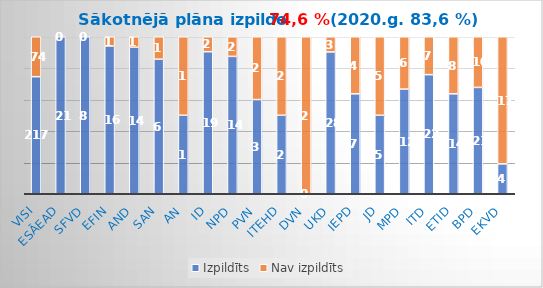
| Category | Izpildīts | Nav izpildīts |
|---|---|---|
| Visi | 217 | 74 |
| ESĀEAD | 21 | 0 |
| SFVD | 8 | 0 |
| EFIN | 16 | 1 |
| AND | 14 | 1 |
| SAN | 6 | 1 |
| AN | 1 | 1 |
| ID | 19 | 2 |
| NPD | 14 | 2 |
| PVN | 3 | 2 |
| ITEHD | 2 | 2 |
| DVN | 0 | 2 |
| UKD | 28 | 3 |
| IEPD | 7 | 4 |
| JD | 5 | 5 |
| MPD | 12 | 6 |
| ITD | 22 | 7 |
| ETID | 14 | 8 |
| BPD | 21 | 10 |
| EKVD | 4 | 17 |